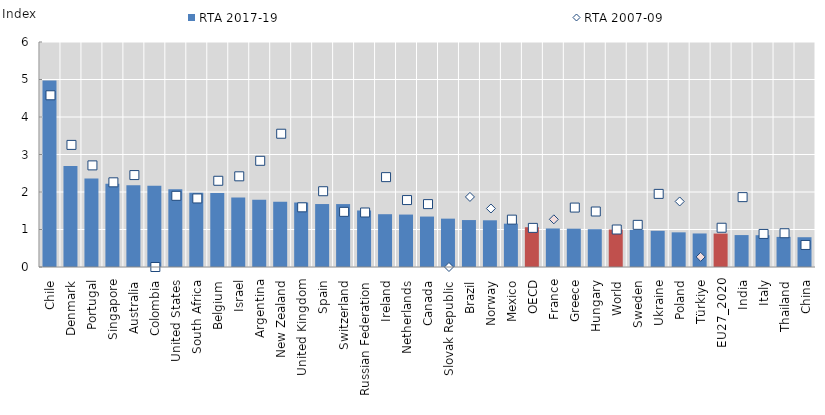
| Category | RTA 2017-19 |
|---|---|
| Chile | 4.974 |
| Denmark | 2.692 |
| Portugal | 2.36 |
| Singapore | 2.218 |
| Australia | 2.179 |
| Colombia | 2.168 |
| United States | 2.074 |
| South Africa | 1.979 |
| Belgium | 1.976 |
| Israel | 1.853 |
| Argentina | 1.793 |
| New Zealand | 1.738 |
| United Kingdom | 1.72 |
| Spain | 1.679 |
| Switzerland | 1.678 |
| Russian Federation | 1.507 |
| Ireland | 1.408 |
| Netherlands | 1.398 |
| Canada | 1.345 |
| Slovak Republic | 1.289 |
| Brazil | 1.252 |
| Norway | 1.246 |
| Mexico | 1.155 |
| OECD | 1.061 |
| France | 1.027 |
| Greece | 1.021 |
| Hungary | 1.008 |
| World | 1 |
| Sweden | 0.991 |
| Ukraine | 0.966 |
| Poland | 0.924 |
| Türkiye | 0.894 |
| EU27_2020 | 0.891 |
| India | 0.851 |
| Italy | 0.848 |
| Thailand | 0.803 |
| China | 0.794 |